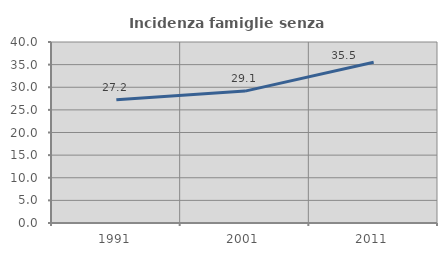
| Category | Incidenza famiglie senza nuclei |
|---|---|
| 1991.0 | 27.239 |
| 2001.0 | 29.15 |
| 2011.0 | 35.537 |